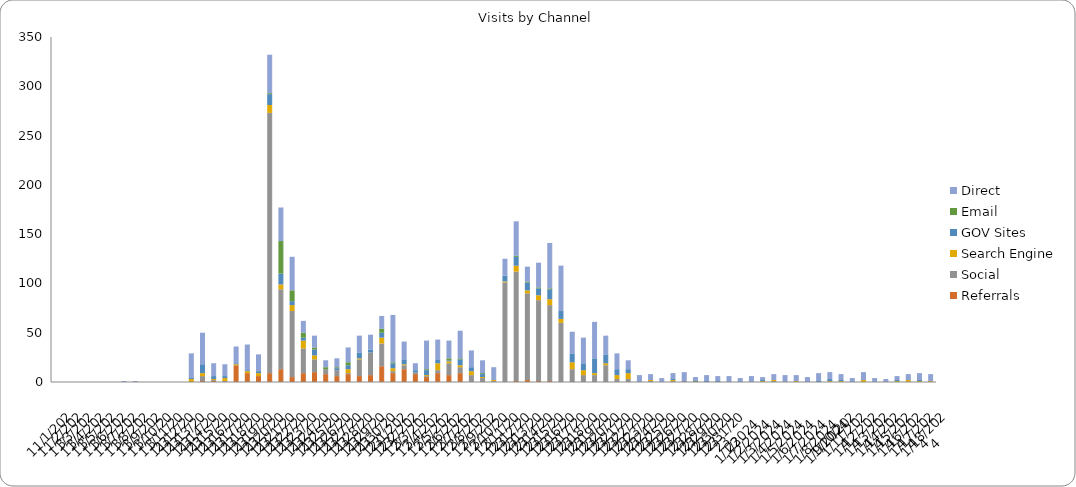
| Category | Series 0 | Referrals | Social | Search Engine | GOV Sites | Email | Direct |
|---|---|---|---|---|---|---|---|
| 11/1/23 |  | 0 | 0 | 0 | 0 | 0 | 0 |
| 11/2/23 |  | 0 | 0 | 0 | 0 | 0 | 0 |
| 11/3/23 |  | 0 | 0 | 0 | 0 | 0 | 0 |
| 11/4/23 |  | 0 | 0 | 0 | 0 | 0 | 0 |
| 11/5/23 |  | 0 | 0 | 0 | 0 | 0 | 0 |
| 11/6/23 |  | 0 | 0 | 0 | 0 | 0 | 0 |
| 11/7/23 |  | 0 | 0 | 0 | 0 | 0 | 1 |
| 11/8/23 |  | 0 | 0 | 0 | 0 | 0 | 1 |
| 11/9/23 |  | 0 | 0 | 0 | 0 | 0 | 0 |
| 11/10/23 |  | 0 | 0 | 0 | 0 | 0 | 0 |
| 11/11/23 |  | 0 | 0 | 0 | 0 | 0 | 0 |
| 11/12/23 |  | 0 | 0 | 0 | 0 | 0 | 0 |
| 11/13/23 |  | 0 | 0 | 3 | 1 | 0 | 25 |
| 11/14/23 |  | 1 | 5 | 3 | 9 | 0 | 32 |
| 11/15/23 |  | 1 | 1 | 1 | 3 | 0 | 13 |
| 11/16/23 |  | 0 | 1 | 3 | 2 | 0 | 12 |
| 11/17/23 |  | 17 | 0 | 1 | 1 | 0 | 17 |
| 11/18/23 |  | 9 | 0 | 2 | 1 | 0 | 26 |
| 11/19/23 |  | 6 | 0 | 3 | 2 | 0 | 17 |
| 11/20/23 |  | 9 | 264 | 8 | 11 | 1 | 39 |
| 11/21/23 |  | 13 | 81 | 5 | 11 | 33 | 34 |
| 11/22/23 |  | 5 | 67 | 6 | 4 | 11 | 34 |
| 11/23/23 |  | 9 | 25 | 8 | 3 | 5 | 12 |
| 11/24/23 |  | 10 | 13 | 4 | 6 | 2 | 12 |
| 11/25/23 |  | 8 | 5 | 0 | 0 | 2 | 7 |
| 11/26/23 |  | 6 | 6 | 0 | 2 | 1 | 9 |
| 11/27/23 |  | 8 | 1 | 4 | 4 | 3 | 15 |
| 11/28/23 |  | 6 | 17 | 1 | 6 | 0 | 17 |
| 11/29/23 |  | 7 | 23 | 0 | 3 | 0 | 15 |
| 11/30/23 |  | 16 | 23 | 6 | 5 | 4 | 13 |
| 12/1/23 |  | 9 | 2 | 3 | 5 | 1 | 48 |
| 12/2/23 |  | 13 | 4 | 1 | 5 | 0 | 18 |
| 12/3/23 |  | 8 | 2 | 0 | 2 | 0 | 7 |
| 12/4/23 |  | 5 | 1 | 1 | 5 | 1 | 29 |
| 12/5/23 |  | 9 | 3 | 7 | 4 | 0 | 20 |
| 12/6/23 |  | 7 | 12 | 2 | 1 | 2 | 18 |
| 12/7/23 |  | 9 | 6 | 2 | 6 | 1 | 28 |
| 12/8/23 |  | 0 | 7 | 4 | 4 | 0 | 17 |
| 12/9/23 |  | 0 | 4 | 1 | 3 | 1 | 13 |
| 12/10/23 |  | 0 | 1 | 1 | 0 | 0 | 13 |
| 12/11/23 |  | 0 | 101 | 1 | 6 | 0 | 17 |
| 12/12/23 |  | 1 | 111 | 6 | 9 | 1 | 35 |
| 12/13/23 |  | 2 | 88 | 3 | 8 | 1 | 15 |
| 12/14/23 |  | 1 | 82 | 5 | 7 | 1 | 25 |
| 12/15/23 |  | 1 | 77 | 6 | 10 | 1 | 46 |
| 12/16/23 |  | 0 | 60 | 4 | 8 | 0 | 46 |
| 12/17/23 |  | 0 | 13 | 7 | 9 | 0 | 22 |
| 12/18/23 |  | 0 | 7 | 5 | 7 | 0 | 26 |
| 12/19/23 |  | 0 | 7 | 2 | 15 | 0 | 37 |
| 12/20/23 |  | 0 | 17 | 2 | 9 | 0 | 19 |
| 12/21/23 |  | 0 | 3 | 4 | 6 | 0 | 16 |
| 12/22/23 |  | 0 | 3 | 6 | 4 | 0 | 9 |
| 12/23/23 |  | 0 | 0 | 0 | 0 | 0 | 7 |
| 12/24/23 |  | 0 | 1 | 1 | 0 | 0 | 6 |
| 12/25/23 |  | 0 | 0 | 0 | 0 | 0 | 4 |
| 12/26/23 |  | 0 | 1 | 1 | 1 | 0 | 6 |
| 12/27/23 |  | 0 | 1 | 0 | 0 | 0 | 9 |
| 12/28/23 |  | 0 | 0 | 0 | 0 | 1 | 4 |
| 12/29/23 |  | 0 | 0 | 0 | 1 | 0 | 6 |
| 12/30/23 |  | 0 | 0 | 0 | 1 | 0 | 5 |
| 12/31/23 |  | 0 | 0 | 0 | 0 | 0 | 6 |
| 1/1/24 |  | 0 | 0 | 0 | 0 | 0 | 4 |
| 1/2/24 |  | 0 | 0 | 0 | 0 | 0 | 6 |
| 1/3/24 |  | 0 | 0 | 1 | 1 | 0 | 3 |
| 1/4/24 |  | 0 | 1 | 1 | 0 | 0 | 6 |
| 1/5/24 |  | 0 | 0 | 0 | 0 | 0 | 7 |
| 1/6/24 |  | 0 | 0 | 1 | 0 | 0 | 6 |
| 1/7/24 |  | 0 | 0 | 0 | 0 | 0 | 5 |
| 1/8/24 |  | 0 | 0 | 0 | 1 | 0 | 8 |
| 1/9/24 |  | 0 | 0 | 1 | 2 | 0 | 7 |
| 1/10/24 |  | 0 | 0 | 1 | 1 | 0 | 6 |
| 1/11/24 |  | 0 | 0 | 0 | 0 | 0 | 4 |
| 1/12/24 |  | 0 | 0 | 2 | 0 | 0 | 8 |
| 1/13/24 |  | 0 | 0 | 0 | 0 | 0 | 4 |
| 1/14/24 |  | 0 | 0 | 0 | 0 | 0 | 3 |
| 1/15/24 |  | 0 | 0 | 1 | 1 | 0 | 4 |
| 1/16/24 |  | 0 | 0 | 2 | 0 | 0 | 6 |
| 1/17/24 |  | 0 | 0 | 1 | 1 | 0 | 7 |
| 1/18/24 |  | 0 | 0 | 1 | 0 | 0 | 7 |